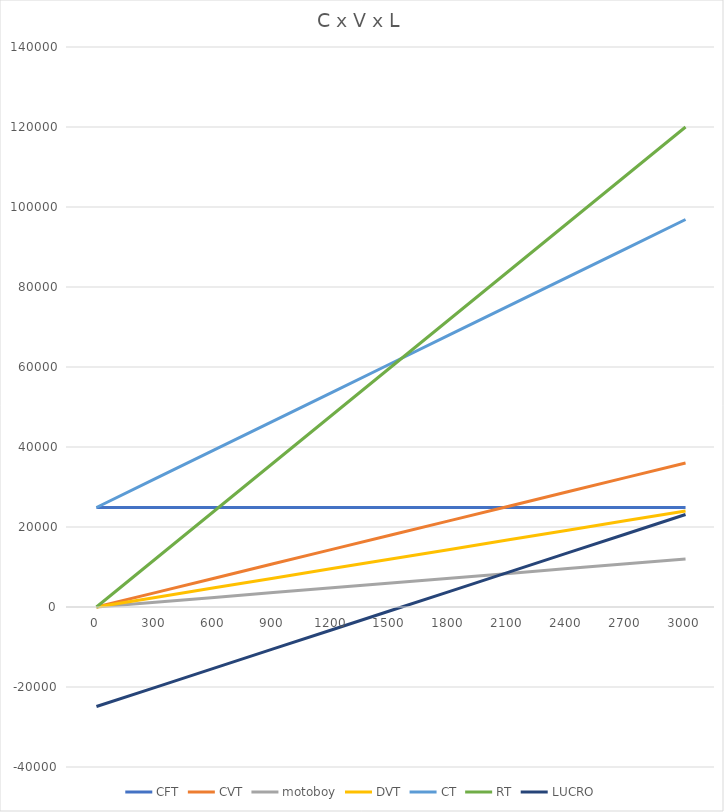
| Category | CFT | CVT | motoboy | DVT | CT | RT | LUCRO |
|---|---|---|---|---|---|---|---|
| 0.0 | 24880 | 0 | 0 | 0 | 24880 | 0 | -24880 |
| 300.0 | 24880 | 3600 | 1200 | 2400 | 32080 | 12000 | -20080 |
| 600.0 | 24880 | 7200 | 2400 | 4800 | 39280 | 24000 | -15280 |
| 900.0 | 24880 | 10800 | 3600 | 7200 | 46480 | 36000 | -10480 |
| 1200.0 | 24880 | 14400 | 4800 | 9600 | 53680 | 48000 | -5680 |
| 1500.0 | 24880 | 18000 | 6000 | 12000 | 60880 | 60000 | -880 |
| 1800.0 | 24880 | 21600 | 7200 | 14400 | 68080 | 72000 | 3920 |
| 2100.0 | 24880 | 25200 | 8400 | 16800 | 75280 | 84000 | 8720 |
| 2400.0 | 24880 | 28800 | 9600 | 19200 | 82480 | 96000 | 13520 |
| 2700.0 | 24880 | 32400 | 10800 | 21600 | 89680 | 108000 | 18320 |
| 3000.0 | 24880 | 36000 | 12000 | 24000 | 96880 | 120000 | 23120 |